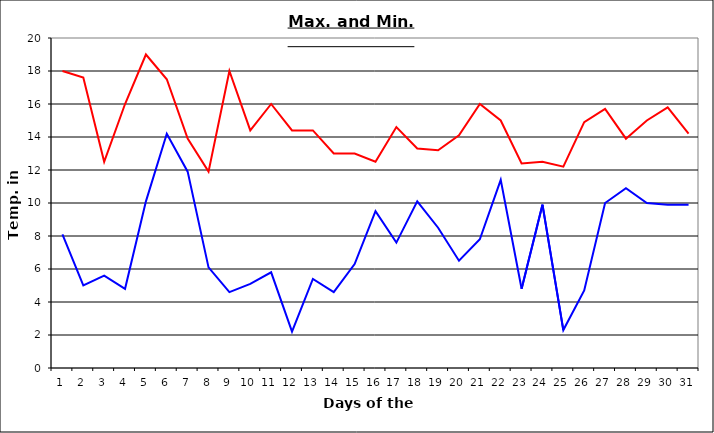
| Category | Series 0 | Series 1 |
|---|---|---|
| 0 | 18 | 8.1 |
| 1 | 17.6 | 5 |
| 2 | 12.5 | 5.6 |
| 3 | 16 | 4.8 |
| 4 | 19 | 10.1 |
| 5 | 17.5 | 14.2 |
| 6 | 13.9 | 11.9 |
| 7 | 11.9 | 6.1 |
| 8 | 18 | 4.6 |
| 9 | 14.4 | 5.1 |
| 10 | 16 | 5.8 |
| 11 | 14.4 | 2.2 |
| 12 | 14.4 | 5.4 |
| 13 | 13 | 4.6 |
| 14 | 13 | 6.3 |
| 15 | 12.5 | 9.5 |
| 16 | 14.6 | 7.6 |
| 17 | 13.3 | 10.1 |
| 18 | 13.2 | 8.5 |
| 19 | 14.1 | 6.5 |
| 20 | 16 | 7.8 |
| 21 | 15 | 11.4 |
| 22 | 12.4 | 4.8 |
| 23 | 12.5 | 9.9 |
| 24 | 12.2 | 2.3 |
| 25 | 14.9 | 4.7 |
| 26 | 15.7 | 10 |
| 27 | 13.9 | 10.9 |
| 28 | 15 | 10 |
| 29 | 15.8 | 9.9 |
| 30 | 14.2 | 9.9 |